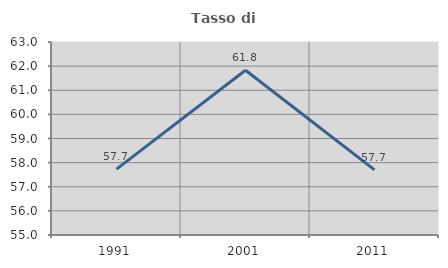
| Category | Tasso di occupazione   |
|---|---|
| 1991.0 | 57.729 |
| 2001.0 | 61.829 |
| 2011.0 | 57.701 |